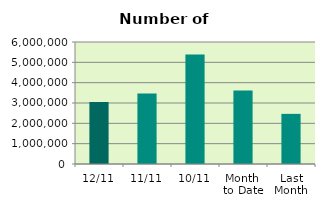
| Category | Series 0 |
|---|---|
| 12/11 | 3044278 |
| 11/11 | 3470066 |
| 10/11 | 5381370 |
| Month 
to Date | 3612288.889 |
| Last
Month | 2465363.545 |